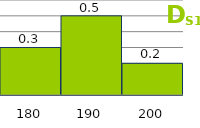
| Category | Series 1 |
|---|---|
| 180.0 | 0.3 |
| 190.0 | 0.5 |
| 200.0 | 0.2 |